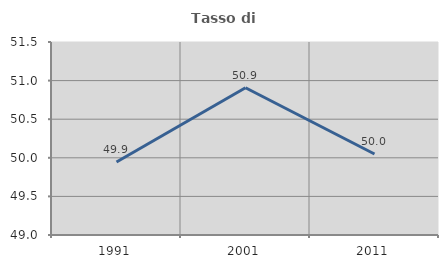
| Category | Tasso di occupazione   |
|---|---|
| 1991.0 | 49.946 |
| 2001.0 | 50.908 |
| 2011.0 | 50.049 |